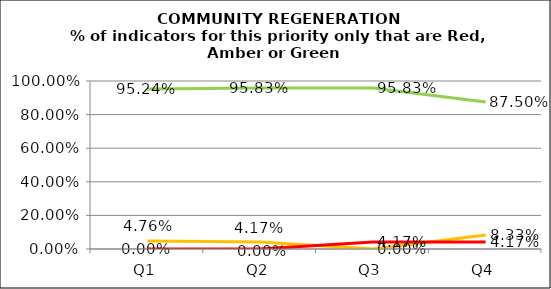
| Category | Green | Amber | Red |
|---|---|---|---|
| Q1 | 0.952 | 0.048 | 0 |
| Q2 | 0.958 | 0.042 | 0 |
| Q3 | 0.958 | 0 | 0.042 |
| Q4 | 0.875 | 0.083 | 0.042 |